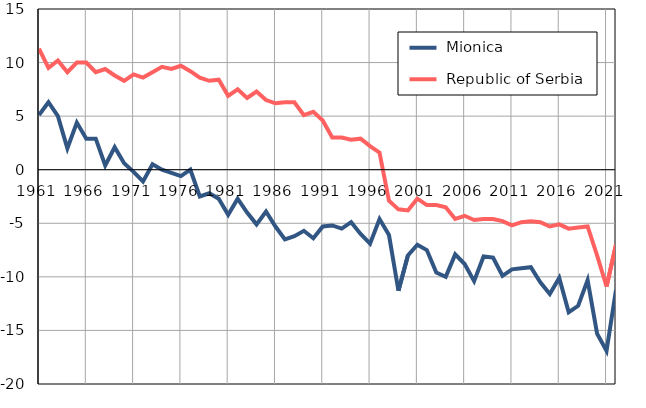
| Category |  Mionica |  Republic of Serbia |
|---|---|---|
| 1961.0 | 5.1 | 11.3 |
| 1962.0 | 6.3 | 9.5 |
| 1963.0 | 5 | 10.2 |
| 1964.0 | 2 | 9.1 |
| 1965.0 | 4.4 | 10 |
| 1966.0 | 2.9 | 10 |
| 1967.0 | 2.9 | 9.1 |
| 1968.0 | 0.4 | 9.4 |
| 1969.0 | 2.1 | 8.8 |
| 1970.0 | 0.6 | 8.3 |
| 1971.0 | -0.2 | 8.9 |
| 1972.0 | -1.1 | 8.6 |
| 1973.0 | 0.5 | 9.1 |
| 1974.0 | 0 | 9.6 |
| 1975.0 | -0.3 | 9.4 |
| 1976.0 | -0.6 | 9.7 |
| 1977.0 | 0 | 9.2 |
| 1978.0 | -2.5 | 8.6 |
| 1979.0 | -2.2 | 8.3 |
| 1980.0 | -2.7 | 8.4 |
| 1981.0 | -4.2 | 6.9 |
| 1982.0 | -2.7 | 7.5 |
| 1983.0 | -4 | 6.7 |
| 1984.0 | -5.1 | 7.3 |
| 1985.0 | -3.9 | 6.5 |
| 1986.0 | -5.3 | 6.2 |
| 1987.0 | -6.5 | 6.3 |
| 1988.0 | -6.2 | 6.3 |
| 1989.0 | -5.7 | 5.1 |
| 1990.0 | -6.4 | 5.4 |
| 1991.0 | -5.3 | 4.6 |
| 1992.0 | -5.2 | 3 |
| 1993.0 | -5.5 | 3 |
| 1994.0 | -4.9 | 2.8 |
| 1995.0 | -6 | 2.9 |
| 1996.0 | -6.9 | 2.2 |
| 1997.0 | -4.6 | 1.6 |
| 1998.0 | -6.1 | -2.9 |
| 1999.0 | -11.3 | -3.7 |
| 2000.0 | -8 | -3.8 |
| 2001.0 | -7 | -2.7 |
| 2002.0 | -7.5 | -3.3 |
| 2003.0 | -9.6 | -3.3 |
| 2004.0 | -10 | -3.5 |
| 2005.0 | -7.9 | -4.6 |
| 2006.0 | -8.8 | -4.3 |
| 2007.0 | -10.4 | -4.7 |
| 2008.0 | -8.1 | -4.6 |
| 2009.0 | -8.2 | -4.6 |
| 2010.0 | -9.9 | -4.8 |
| 2011.0 | -9.3 | -5.2 |
| 2012.0 | -9.2 | -4.9 |
| 2013.0 | -9.1 | -4.8 |
| 2014.0 | -10.5 | -4.9 |
| 2015.0 | -11.6 | -5.3 |
| 2016.0 | -10.1 | -5.1 |
| 2017.0 | -13.3 | -5.5 |
| 2018.0 | -12.7 | -5.4 |
| 2019.0 | -10.3 | -5.3 |
| 2020.0 | -15.3 | -8 |
| 2021.0 | -16.9 | -10.9 |
| 2022.0 | -11.2 | -7 |